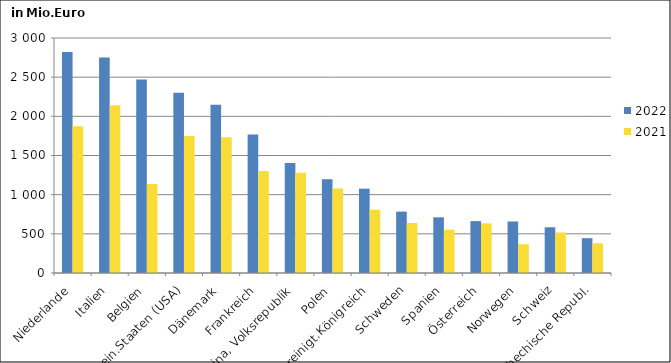
| Category | 2022 | 2021 |
|---|---|---|
| Niederlande | 2822.165 | 1873.937 |
| Italien | 2749.561 | 2142.145 |
| Belgien | 2470.433 | 1135.792 |
| Verein.Staaten (USA) | 2300.524 | 1747.532 |
| Dänemark | 2146.425 | 1732.92 |
| Frankreich | 1767.018 | 1302.857 |
| China, Volksrepublik | 1403.107 | 1281.09 |
| Polen | 1196.517 | 1078.39 |
| Vereinigt.Königreich | 1076.556 | 807.449 |
| Schweden | 783.64 | 638.669 |
| Spanien | 710.958 | 553.253 |
| Österreich | 662.429 | 633.983 |
| Norwegen | 657.775 | 366.753 |
| Schweiz | 583.749 | 516.413 |
| Tschechische Republ. | 444.679 | 379.113 |